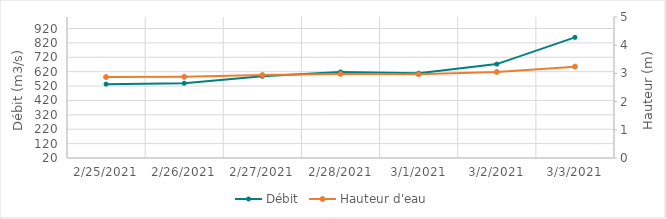
| Category | Débit |
|---|---|
| 2/2/21 | 783.67 |
| 2/1/21 | 673.75 |
| 1/31/21 | 550.88 |
| 1/30/21 | 530.32 |
| 1/29/21 | 498.51 |
| 1/28/21 | 453.72 |
| 1/27/21 | 456.19 |